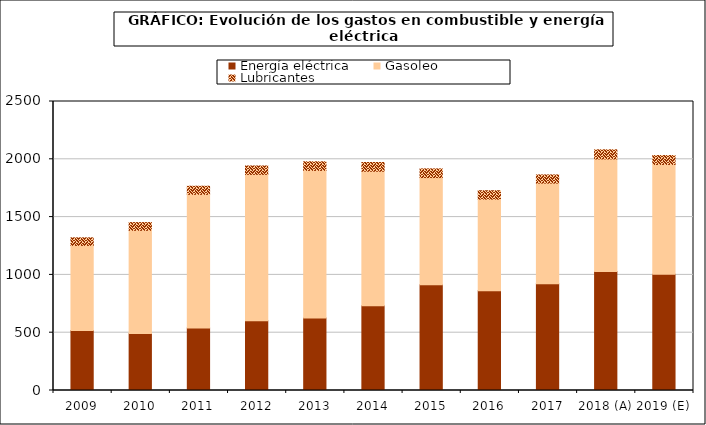
| Category | Energía eléctrica | Gasoleo | Lubricantes |
|---|---|---|---|
| 2009 | 519.861 | 735.254 | 65.464 |
| 2010 | 492.737 | 892.822 | 66.957 |
| 2011 | 541.39 | 1155.464 | 70.222 |
| 2012 | 602.887 | 1266.655 | 72.753 |
| 2013 | 628.022 | 1275.795 | 74.642 |
| 2014 | 733.314 | 1163.411 | 75.37 |
| 2015 | 915.498 | 926.353 | 75.218 |
| 2016 | 861.816 | 793.633 | 72.641 |
| 2017 | 922.733 | 871.301 | 70.822 |
| 2018 (A) | 1030.23 | 972.806 | 79.073 |
| 2019 (E) | 1005.688 | 949.633 | 77.189 |